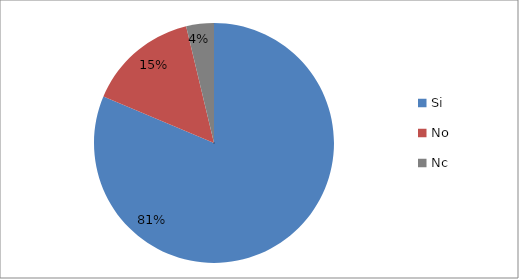
| Category | Series 0 | Series 1 | Series 2 |
|---|---|---|---|
| Si |  |  | 305 |
| No |  |  | 56 |
| Nc |  |  | 14 |